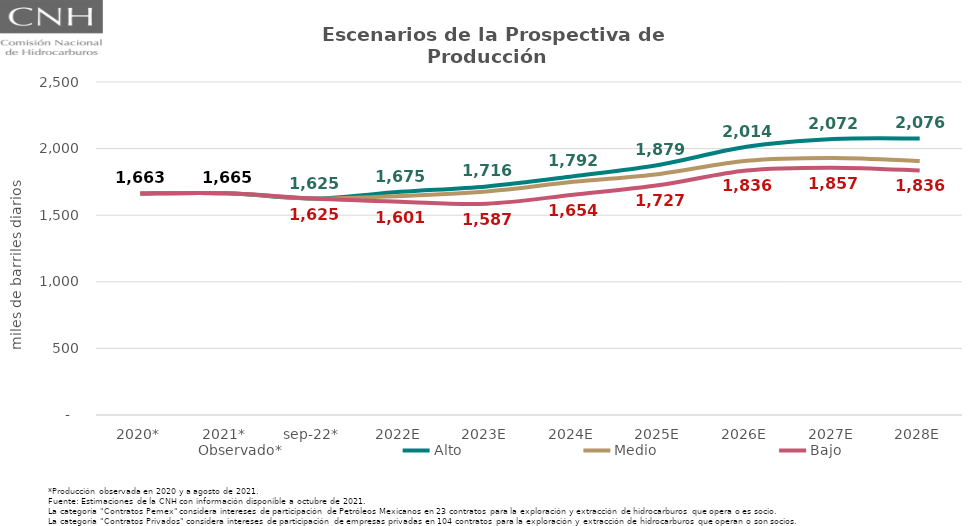
| Category | Observado* | Alto | Medio | Bajo |
|---|---|---|---|---|
| 2020* | 1663.067 | 1663.067 | 1663.067 | 1663.067 |
| 2021* | 1664.715 | 1664.715 | 1664.715 | 1664.715 |
| sep-22* | 1625.017 | 1625.017 | 1625.017 | 1625.017 |
| 2022E | 1644.886 | 1675.365 | 1644.886 | 1601.101 |
| 2023E | 1678.556 | 1716.232 | 1678.556 | 1586.59 |
| 2024E | 1750.398 | 1792.31 | 1750.398 | 1653.739 |
| 2025E | 1810.029 | 1879.227 | 1810.029 | 1726.72 |
| 2026E | 1908.851 | 2013.86 | 1908.851 | 1836.06 |
| 2027E | 1930.284 | 2071.645 | 1930.284 | 1856.982 |
| 2028E | 1907.342 | 2075.945 | 1907.342 | 1835.624 |